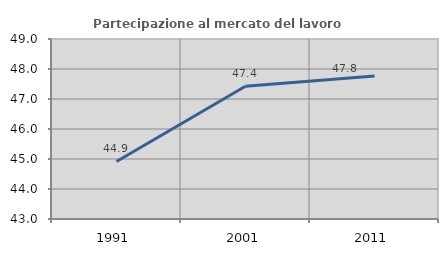
| Category | Partecipazione al mercato del lavoro  femminile |
|---|---|
| 1991.0 | 44.919 |
| 2001.0 | 47.426 |
| 2011.0 | 47.77 |